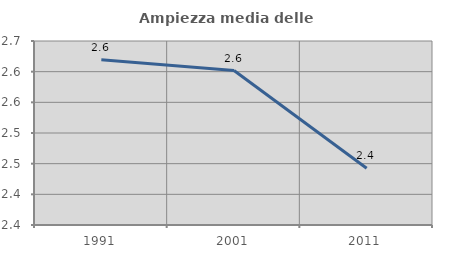
| Category | Ampiezza media delle famiglie |
|---|---|
| 1991.0 | 2.62 |
| 2001.0 | 2.602 |
| 2011.0 | 2.442 |